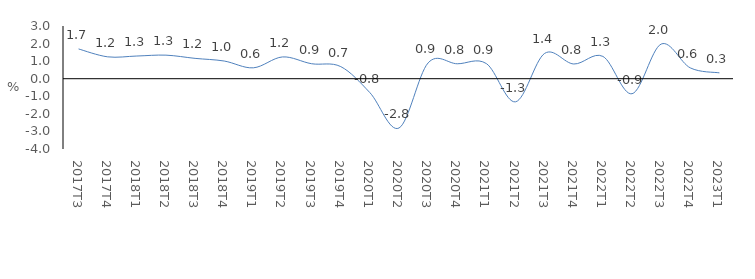
| Category | Series 0 |
|---|---|
| 2017Τ3 | 1.694 |
| 2017Τ4 | 1.245 |
| 2018Τ1 | 1.292 |
| 2018Τ2 | 1.341 |
| 2018Τ3 | 1.158 |
| 2018Τ4 | 1.007 |
| 2019Τ1 | 0.62 |
| 2019Τ2 | 1.239 |
| 2019Τ3 | 0.853 |
| 2019Τ4 | 0.69 |
| 2020Τ1 | -0.792 |
| 2020Τ2 | -2.805 |
| 2020Τ3 | 0.901 |
| 2020Τ4 | 0.85 |
| 2021Τ1 | 0.86 |
| 2021Τ2 | -1.315 |
| 2021Τ3 | 1.442 |
| 2021Τ4 | 0.838 |
| 2022Τ1 | 1.27 |
| 2022Τ2 | -0.855 |
| 2022Τ3 | 1.973 |
| 2022Τ4 | 0.616 |
| 2023Τ1 | 0.334 |